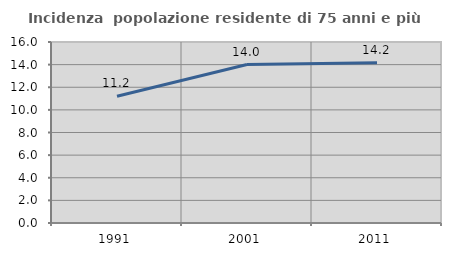
| Category | Incidenza  popolazione residente di 75 anni e più |
|---|---|
| 1991.0 | 11.205 |
| 2001.0 | 14.006 |
| 2011.0 | 14.16 |